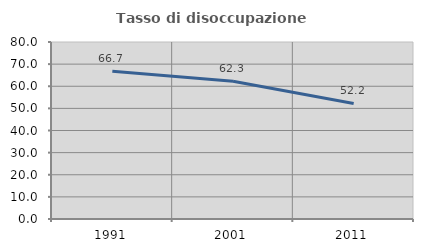
| Category | Tasso di disoccupazione giovanile  |
|---|---|
| 1991.0 | 66.727 |
| 2001.0 | 62.287 |
| 2011.0 | 52.245 |